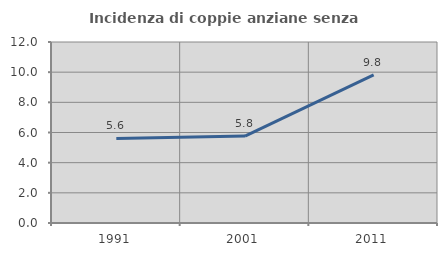
| Category | Incidenza di coppie anziane senza figli  |
|---|---|
| 1991.0 | 5.609 |
| 2001.0 | 5.766 |
| 2011.0 | 9.824 |